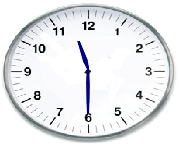
| Category | Series 0 |
|---|---|
| 0.0 | 0 |
| -0.0976827821223184 | 0.23 |
| -0.23293714059226878 | 0.869 |
| -0.03046733585128684 | 0.248 |
| 0.0 | 0 |
| -0.0813920386142891 | 0.236 |
| -0.23293714059226878 | 0.869 |
| -0.0477022488441362 | 0.245 |
| 0.0 | 0 |
| 0.017449748351250197 | -0.5 |
| -2.6646978894262485e-16 | -1.45 |
| 0.008726203218641565 | -0.5 |
| 0.0 | 0 |
| -0.01744974835125038 | -0.5 |
| -2.6646978894262485e-16 | -1.45 |
| -0.008726203218641749 | -0.5 |
| 0.0 | 0 |